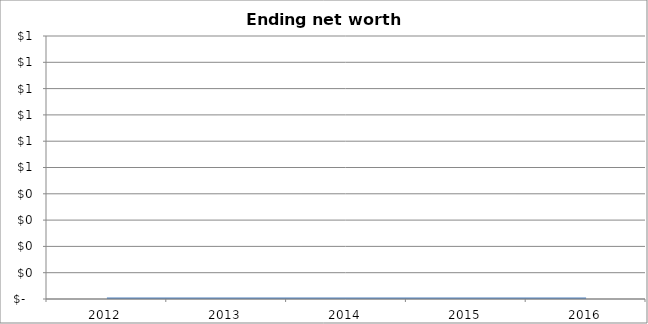
| Category | Ending net worth[C-D] |
|---|---|
| 2012.0 | 0 |
| 2013.0 | 0 |
| 2014.0 | 0 |
| 2015.0 | 0 |
| 2016.0 | 0 |